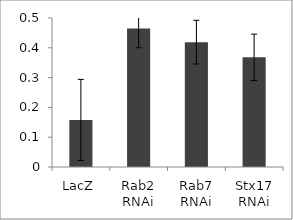
| Category | Series 0 |
|---|---|
| LacZ | 0.158 |
| Rab2 RNAi | 0.464 |
| Rab7 RNAi | 0.419 |
| Stx17 RNAi | 0.368 |